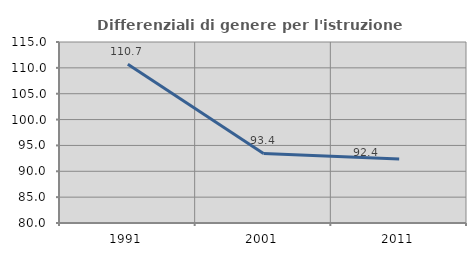
| Category | Differenziali di genere per l'istruzione superiore |
|---|---|
| 1991.0 | 110.697 |
| 2001.0 | 93.444 |
| 2011.0 | 92.36 |